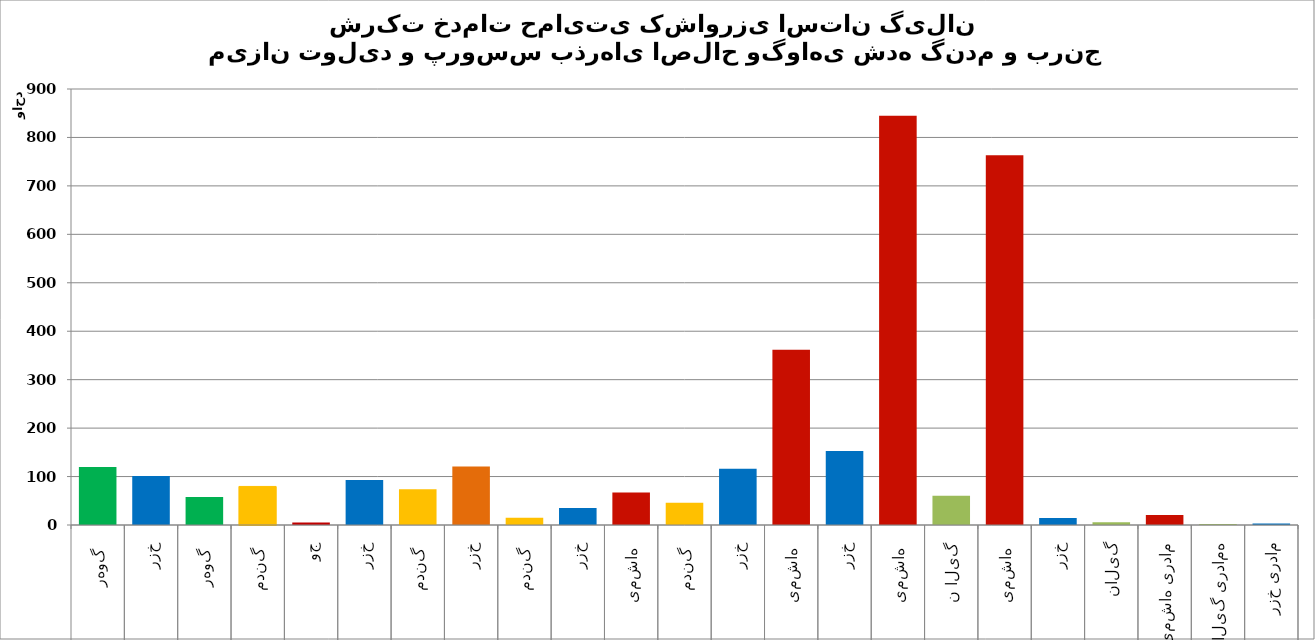
| Category | مقدار بذر استحصالی قابل توزیع  |
|---|---|
| 0 | 119760 |
| 1 | 100980 |
| 2 | 57810 |
| 3 | 79600 |
| 4 | 5000 |
| 5 | 92970 |
| 6 | 74000 |
| 7 | 120990 |
| 8 | 14985 |
| 9 | 34950 |
| 10 | 67050 |
| 11 | 45925 |
| 12 | 116240 |
| 13 | 361500 |
| 14 | 152740 |
| 15 | 844653 |
| 16 | 60259 |
| 17 | 763044 |
| 18 | 14376 |
| 19 | 5763 |
| 20 | 20650 |
| 21 | 2153 |
| 22 | 3176 |